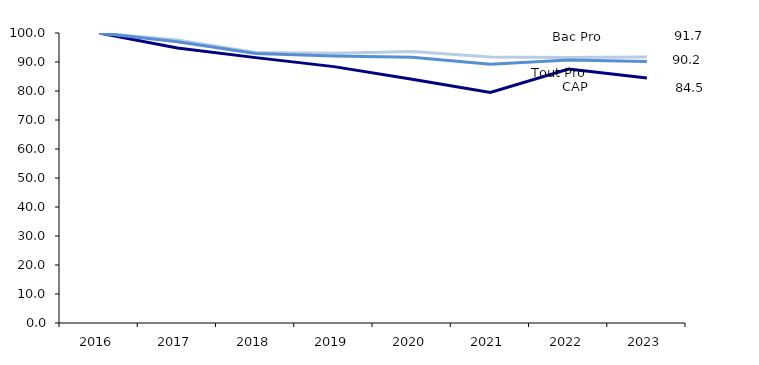
| Category | CAP | Bac Pro | Tout Pro |
|---|---|---|---|
| 2016.0 | 100 | 100 | 100 |
| 2017.0 | 94.824 | 97.57 | 97.002 |
| 2018.0 | 91.511 | 93.305 | 92.934 |
| 2019.0 | 88.406 | 93.035 | 92.077 |
| 2020.0 | 84.058 | 93.629 | 91.649 |
| 2021.0 | 79.503 | 91.739 | 89.208 |
| 2022.0 | 87.578 | 91.523 | 90.707 |
| 2023.0 | 84.472 | 91.685 | 90.193 |